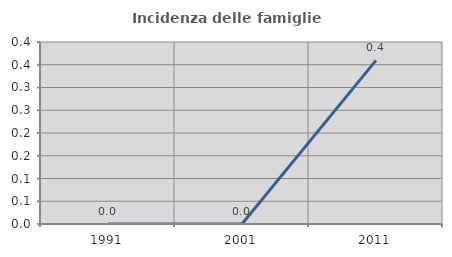
| Category | Incidenza delle famiglie numerose |
|---|---|
| 1991.0 | 0 |
| 2001.0 | 0 |
| 2011.0 | 0.36 |